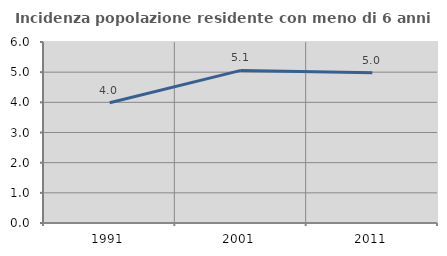
| Category | Incidenza popolazione residente con meno di 6 anni |
|---|---|
| 1991.0 | 3.987 |
| 2001.0 | 5.058 |
| 2011.0 | 4.984 |